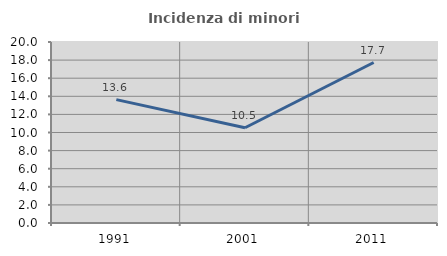
| Category | Incidenza di minori stranieri |
|---|---|
| 1991.0 | 13.636 |
| 2001.0 | 10.526 |
| 2011.0 | 17.732 |